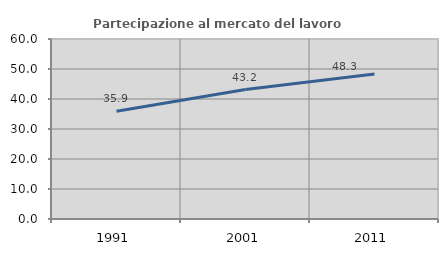
| Category | Partecipazione al mercato del lavoro  femminile |
|---|---|
| 1991.0 | 35.929 |
| 2001.0 | 43.164 |
| 2011.0 | 48.343 |